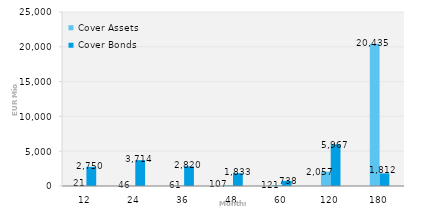
| Category | Cover Assets | Cover Bonds |
|---|---|---|
| 12.0 | 21.458 | 2750.141 |
| 24.0 | 45.541 | 3714 |
| 36.0 | 61.241 | 2820.286 |
| 48.0 | 107.023 | 1832.5 |
| 60.0 | 120.883 | 737.5 |
| 120.0 | 2056.77 | 5967.016 |
| 180.0 | 20435.321 | 1812.256 |